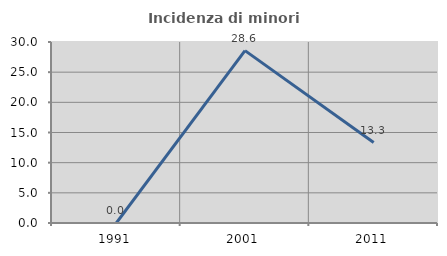
| Category | Incidenza di minori stranieri |
|---|---|
| 1991.0 | 0 |
| 2001.0 | 28.571 |
| 2011.0 | 13.333 |